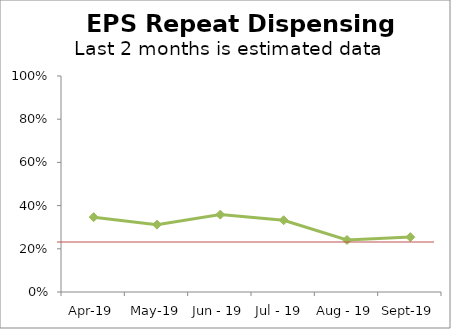
| Category | 27 BEAUMONT STREET |
|---|---|
| Apr-19 | 0.346 |
| May-19 | 0.312 |
| Jun - 19 | 0.358 |
| Jul - 19  | 0.332 |
| Aug - 19 | 0.241 |
| Sept-19 | 0.254 |